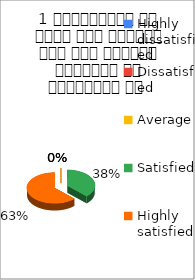
| Category | 1 व्याख्यान से रूचि में वृद्धि हुई एवं शिक्षण जानकारी से परिपूर्ण था  |
|---|---|
| Highly dissatisfied | 0 |
| Dissatisfied | 0 |
| Average | 0 |
| Satisfied | 3 |
| Highly satisfied | 5 |